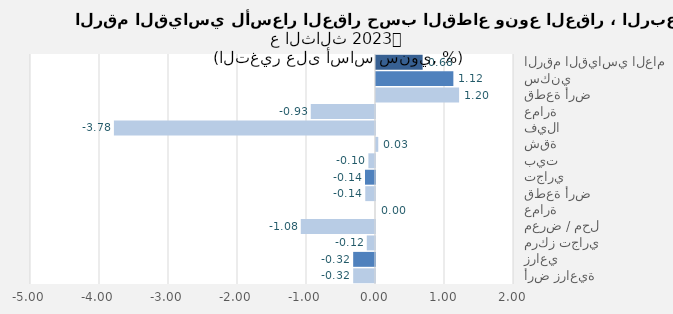
| Category | Series 0 |
|---|---|
| الرقم القياسي العام | 0.676 |
| سكني | 1.121 |
| قطعة أرض | 1.204 |
| عمارة | -0.931 |
| فيلا | -3.784 |
| شقة | 0.033 |
| بيت | -0.096 |
| تجاري | -0.145 |
| قطعة أرض | -0.141 |
| عمارة | 0 |
| معرض / محل | -1.075 |
| مركز تجاري | -0.119 |
| زراعي | -0.316 |
| أرض زراعية | -0.316 |